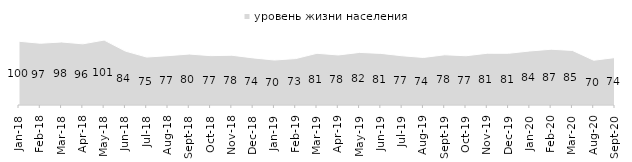
| Category | уровень жизни населения |
|---|---|
| 2018-01-01 | 99.6 |
| 2018-02-01 | 96.5 |
| 2018-03-01 | 98.45 |
| 2018-04-01 | 95.55 |
| 2018-05-01 | 101.45 |
| 2018-06-01 | 84.2 |
| 2018-07-01 | 74.9 |
| 2018-08-01 | 77.1 |
| 2018-09-01 | 79.6 |
| 2018-10-01 | 77.1 |
| 2018-11-01 | 77.745 |
| 2018-12-01 | 73.6 |
| 2019-01-01 | 70.25 |
| 2019-02-01 | 72.55 |
| 2019-03-01 | 80.806 |
| 2019-04-01 | 78.168 |
| 2019-05-01 | 82.169 |
| 2019-06-01 | 80.648 |
| 2019-07-01 | 76.881 |
| 2019-08-01 | 74.276 |
| 2019-09-01 | 78.465 |
| 2019-10-01 | 76.931 |
| 2019-11-01 | 80.842 |
| 2019-12-01 | 80.792 |
| 2020-01-01 | 84.406 |
| 2020-02-01 | 87.129 |
| 2020-03-01 | 85.275 |
| 2020-08-01 | 69.911 |
| 2020-09-01 | 74.116 |